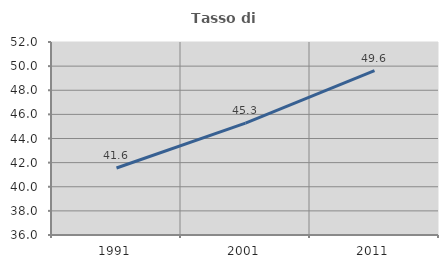
| Category | Tasso di occupazione   |
|---|---|
| 1991.0 | 41.552 |
| 2001.0 | 45.273 |
| 2011.0 | 49.625 |